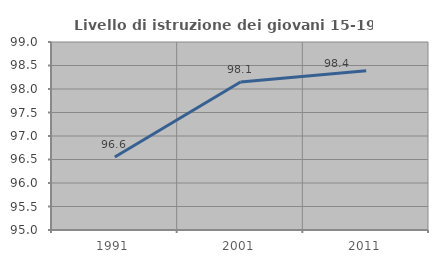
| Category | Livello di istruzione dei giovani 15-19 anni |
|---|---|
| 1991.0 | 96.552 |
| 2001.0 | 98.148 |
| 2011.0 | 98.387 |